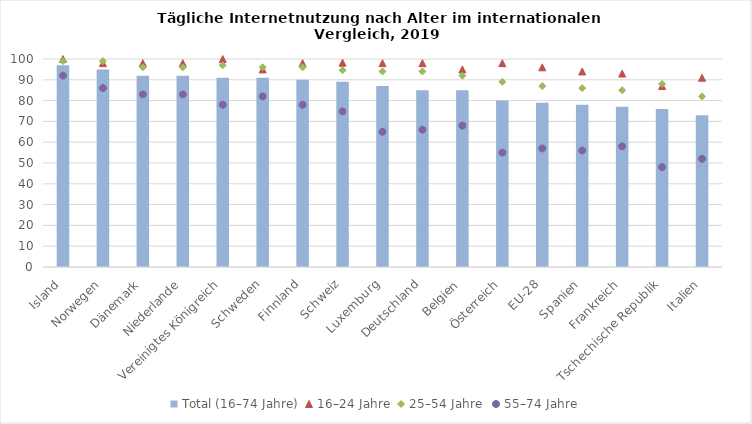
| Category | Total (16–74 Jahre) |
|---|---|
| Island | 97 |
| Norwegen | 95 |
| Dänemark | 92 |
| Niederlande | 92 |
| Vereinigtes Königreich | 91 |
| Schweden | 91 |
| Finnland | 90 |
| Schweiz | 89.02 |
| Luxemburg | 87 |
| Deutschland | 85 |
| Belgien | 85 |
| Österreich | 80 |
| EU-28 | 79 |
| Spanien | 78 |
| Frankreich | 77 |
| Tschechische Republik | 76 |
| Italien | 73 |